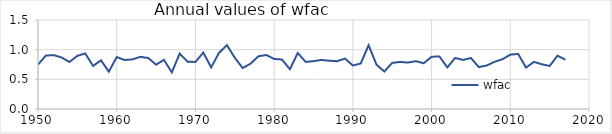
| Category | wfac |
|---|---|
| 1950.0 | 0.747 |
| 1951.0 | 0.901 |
| 1952.0 | 0.908 |
| 1953.0 | 0.868 |
| 1954.0 | 0.793 |
| 1955.0 | 0.896 |
| 1956.0 | 0.936 |
| 1957.0 | 0.726 |
| 1958.0 | 0.821 |
| 1959.0 | 0.628 |
| 1960.0 | 0.875 |
| 1961.0 | 0.826 |
| 1962.0 | 0.837 |
| 1963.0 | 0.879 |
| 1964.0 | 0.859 |
| 1965.0 | 0.747 |
| 1966.0 | 0.828 |
| 1967.0 | 0.618 |
| 1968.0 | 0.934 |
| 1969.0 | 0.798 |
| 1970.0 | 0.793 |
| 1971.0 | 0.95 |
| 1972.0 | 0.702 |
| 1973.0 | 0.947 |
| 1974.0 | 1.076 |
| 1975.0 | 0.864 |
| 1976.0 | 0.691 |
| 1977.0 | 0.763 |
| 1978.0 | 0.889 |
| 1979.0 | 0.91 |
| 1980.0 | 0.844 |
| 1981.0 | 0.834 |
| 1982.0 | 0.67 |
| 1983.0 | 0.944 |
| 1984.0 | 0.794 |
| 1985.0 | 0.806 |
| 1986.0 | 0.827 |
| 1987.0 | 0.814 |
| 1988.0 | 0.805 |
| 1989.0 | 0.85 |
| 1990.0 | 0.733 |
| 1991.0 | 0.767 |
| 1992.0 | 1.075 |
| 1993.0 | 0.748 |
| 1994.0 | 0.632 |
| 1995.0 | 0.777 |
| 1996.0 | 0.793 |
| 1997.0 | 0.783 |
| 1998.0 | 0.806 |
| 1999.0 | 0.771 |
| 2000.0 | 0.881 |
| 2001.0 | 0.886 |
| 2002.0 | 0.701 |
| 2003.0 | 0.861 |
| 2004.0 | 0.827 |
| 2005.0 | 0.86 |
| 2006.0 | 0.706 |
| 2007.0 | 0.732 |
| 2008.0 | 0.795 |
| 2009.0 | 0.838 |
| 2010.0 | 0.916 |
| 2011.0 | 0.928 |
| 2012.0 | 0.697 |
| 2013.0 | 0.794 |
| 2014.0 | 0.754 |
| 2015.0 | 0.725 |
| 2016.0 | 0.899 |
| 2017.0 | 0.83 |